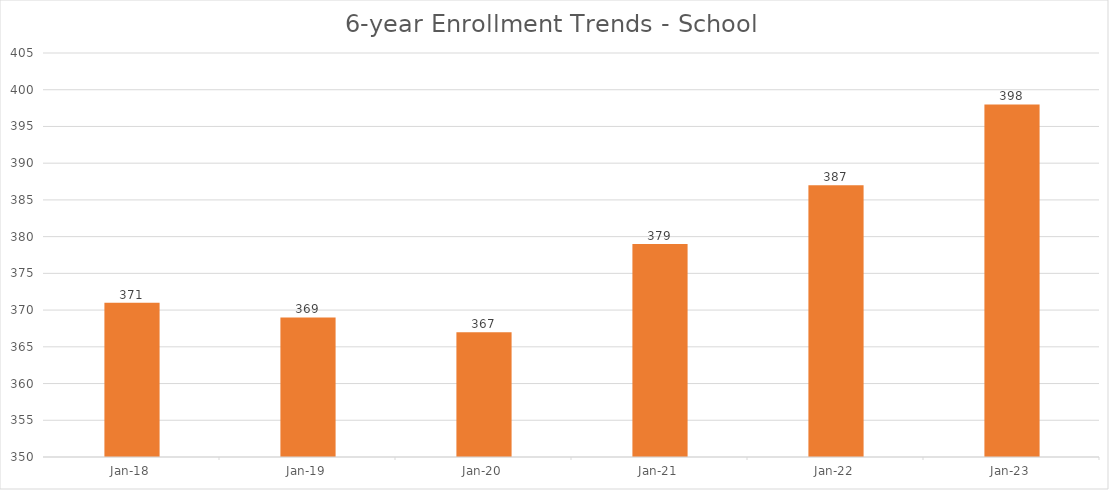
| Category | Series 0 |
|---|---|
| 2018-06-01 | 371 |
| 2019-06-01 | 369 |
| 2020-06-01 | 367 |
| 2021-06-01 | 379 |
| 2022-06-01 | 387 |
| 2023-06-01 | 398 |